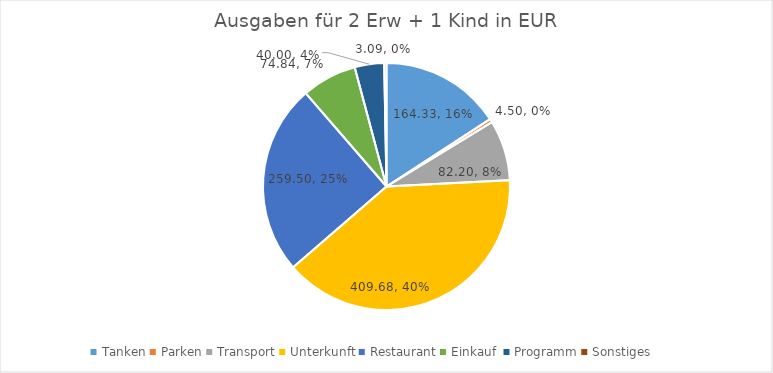
| Category | Series 0 |
|---|---|
| Tanken | 164.325 |
| Parken | 4.5 |
| Transport | 82.2 |
| Unterkunft | 409.68 |
| Restaurant | 259.5 |
| Einkauf  | 74.835 |
| Programm | 40 |
| Sonstiges | 3.09 |